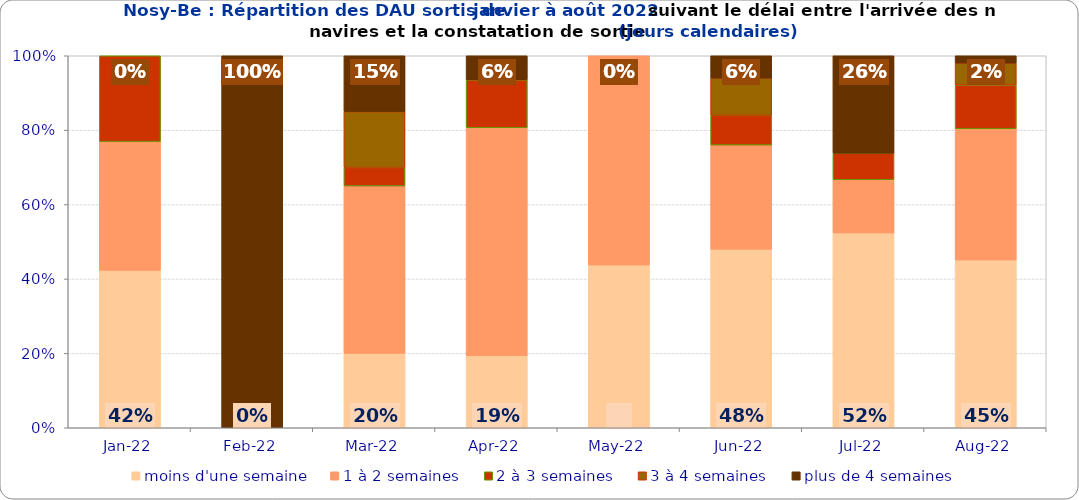
| Category | moins d'une semaine | 1 à 2 semaines | 2 à 3 semaines | 3 à 4 semaines | plus de 4 semaines |
|---|---|---|---|---|---|
| 2022-01-01 | 0.423 | 0.346 | 0.231 | 0 | 0 |
| 2022-02-01 | 0 | 0 | 0 | 0 | 1 |
| 2022-03-01 | 0.2 | 0.45 | 0.05 | 0.15 | 0.15 |
| 2022-04-01 | 0.194 | 0.613 | 0.129 | 0 | 0.065 |
| 2022-05-01 | 0.438 | 0.562 | 0 | 0 | 0 |
| 2022-06-01 | 0.48 | 0.28 | 0.08 | 0.1 | 0.06 |
| 2022-07-01 | 0.524 | 0.143 | 0.071 | 0 | 0.262 |
| 2022-08-01 | 0.451 | 0.353 | 0.118 | 0.059 | 0.02 |